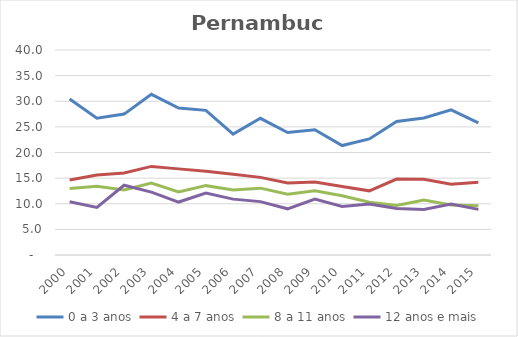
| Category | 0 a 3 anos | 4 a 7 anos | 8 a 11 anos | 12 anos e mais |
|---|---|---|---|---|
| 2000.0 | 30.436 | 14.635 | 12.985 | 10.375 |
| 2001.0 | 26.697 | 15.613 | 13.432 | 9.297 |
| 2002.0 | 27.493 | 16.016 | 12.672 | 13.608 |
| 2003.0 | 31.348 | 17.289 | 14.027 | 12.267 |
| 2004.0 | 28.672 | 16.805 | 12.313 | 10.333 |
| 2005.0 | 28.222 | 16.351 | 13.532 | 12.069 |
| 2006.0 | 23.59 | 15.775 | 12.668 | 10.903 |
| 2007.0 | 26.671 | 15.147 | 13.042 | 10.415 |
| 2008.0 | 23.907 | 14.054 | 11.851 | 9.013 |
| 2009.0 | 24.45 | 14.253 | 12.538 | 10.899 |
| 2010.0 | 21.355 | 13.35 | 11.56 | 9.465 |
| 2011.0 | 22.654 | 12.519 | 10.285 | 9.93 |
| 2012.0 | 26.049 | 14.811 | 9.666 | 9.094 |
| 2013.0 | 26.721 | 14.776 | 10.713 | 8.864 |
| 2014.0 | 28.323 | 13.827 | 9.776 | 9.929 |
| 2015.0 | 25.796 | 14.178 | 9.627 | 8.897 |